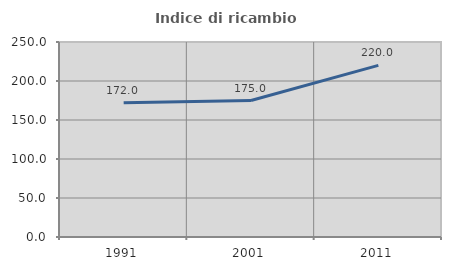
| Category | Indice di ricambio occupazionale  |
|---|---|
| 1991.0 | 172 |
| 2001.0 | 175 |
| 2011.0 | 220 |